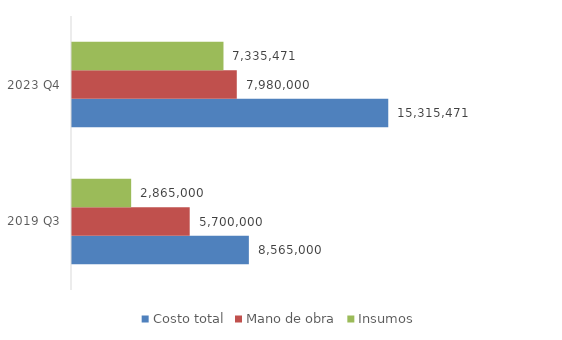
| Category | Costo total | Mano de obra | Insumos |
|---|---|---|---|
| 2019 Q3 | 8564999.8 | 5700000 | 2864999.8 |
| 2023 Q4 | 15315470.638 | 7980000 | 7335470.638 |